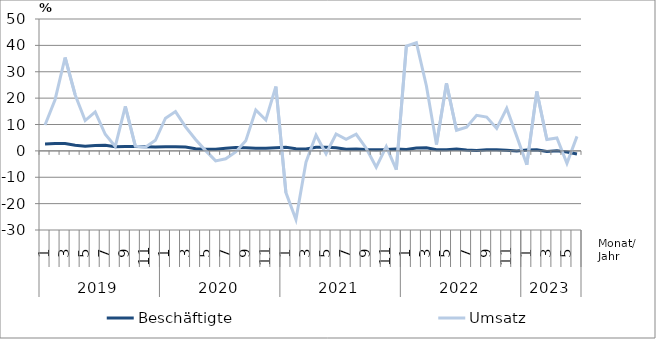
| Category | Beschäftigte | Umsatz |
|---|---|---|
| 0 | 2.6 | 9.8 |
| 1 | 2.8 | 19.4 |
| 2 | 2.8 | 35.4 |
| 3 | 2.1 | 21.3 |
| 4 | 1.8 | 11.5 |
| 5 | 2 | 14.8 |
| 6 | 2.1 | 6.3 |
| 7 | 1.6 | 1.7 |
| 8 | 1.7 | 16.9 |
| 9 | 1.7 | 1.8 |
| 10 | 1.6 | 1.4 |
| 11 | 1.5 | 4 |
| 12 | 1.6 | 12.4 |
| 13 | 1.6 | 14.9 |
| 14 | 1.5 | 9.1 |
| 15 | 0.8 | 4.3 |
| 16 | 0.6 | 0.1 |
| 17 | 0.6 | -3.8 |
| 18 | 1 | -3 |
| 19 | 1.3 | -0.4 |
| 20 | 1.2 | 3.8 |
| 21 | 1 | 15.5 |
| 22 | 1 | 11.7 |
| 23 | 1.2 | 24.4 |
| 24 | 1.4 | -15.8 |
| 25 | 0.8 | -26 |
| 26 | 0.7 | -4.3 |
| 27 | 1.4 | 6 |
| 28 | 1.4 | -1.1 |
| 29 | 1.2 | 6.4 |
| 30 | 0.6 | 4.4 |
| 31 | 0.7 | 6.3 |
| 32 | 0.5 | 1 |
| 33 | 0.4 | -6.2 |
| 34 | 0.5 | 1.6 |
| 35 | 0.7 | -7.1 |
| 36 | 0.5 | 39.7 |
| 37 | 1.1 | 41 |
| 38 | 1.2 | 24.6 |
| 39 | 0.4 | 2.4 |
| 40 | 0.4 | 25.6 |
| 41 | 0.7 | 7.8 |
| 42 | 0.3 | 9 |
| 43 | 0.1 | 13.5 |
| 44 | 0.4 | 12.8 |
| 45 | 0.4 | 8.5 |
| 46 | 0.2 | 16.1 |
| 47 | 0 | 5.5 |
| 48 | 0.3 | -5.3 |
| 49 | 0.4 | 22.5 |
| 50 | -0.2 | 4.3 |
| 51 | 0 | 4.9 |
| 52 | -0.4 | -4.7 |
| 53 | -1.2 | 5.5 |